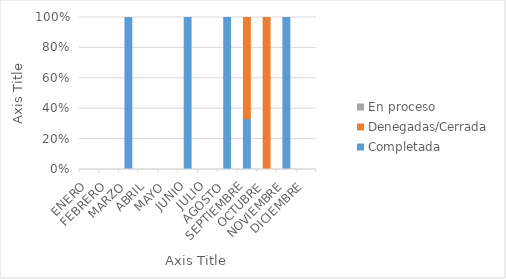
| Category | Completada | Denegadas/Cerrada | En proceso |
|---|---|---|---|
| ENERO | 0 | 0 | 0 |
| FEBRERO | 0 | 0 | 0 |
| MARZO | 1 | 0 | 0 |
| ABRIL | 0 | 0 | 0 |
| MAYO | 0 | 0 | 0 |
| JUNIO | 2 | 0 | 0 |
| JULIO | 0 | 0 | 0 |
| AGOSTO | 1 | 0 | 0 |
| SEPTIEMBRE | 1 | 2 | 0 |
| OCTUBRE | 0 | 1 | 0 |
| NOVIEMBRE | 1 | 0 | 0 |
| DICIEMBRE | 0 | 0 | 0 |